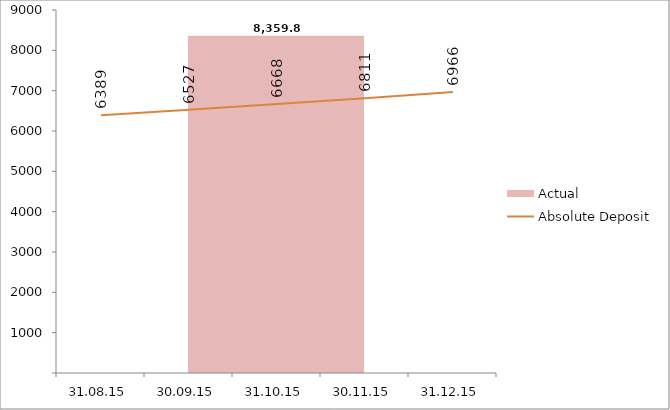
| Category | Actual |
|---|---|
| 31.08.15 | 8359.874 |